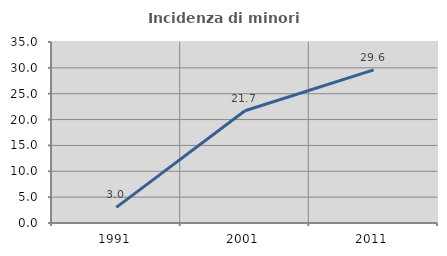
| Category | Incidenza di minori stranieri |
|---|---|
| 1991.0 | 3.03 |
| 2001.0 | 21.705 |
| 2011.0 | 29.623 |